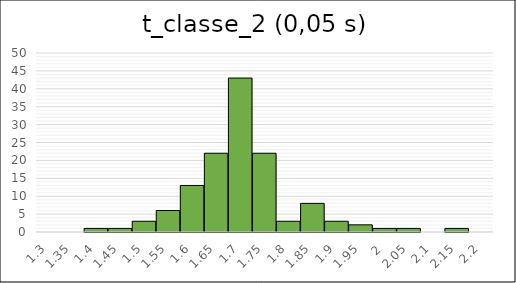
| Category | Series 2 |
|---|---|
| 1.3 | 0 |
| 1.35 | 0 |
| 1.4 | 1 |
| 1.45 | 1 |
| 1.5 | 3 |
| 1.55 | 6 |
| 1.6 | 13 |
| 1.65 | 22 |
| 1.7 | 43 |
| 1.75 | 22 |
| 1.8 | 3 |
| 1.85 | 8 |
| 1.9 | 3 |
| 1.95 | 2 |
| 2.0 | 1 |
| 2.05 | 1 |
| 2.1 | 0 |
| 2.15 | 1 |
| 2.2 | 0 |